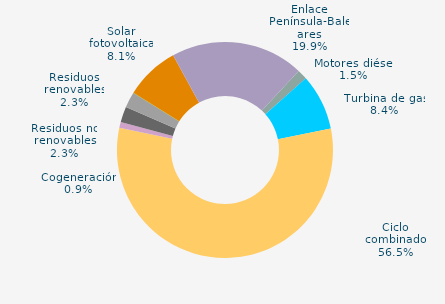
| Category | Series 0 |
|---|---|
| Carbón | 0 |
| Motores diésel | 1.506 |
| Turbina de gas | 8.363 |
| Ciclo combinado | 56.495 |
| Generación auxiliar | 0 |
| Cogeneración | 0.868 |
| Residuos no renovables | 2.334 |
| Residuos renovables | 2.334 |
| Eólica | 0.049 |
| Solar fotovoltaica | 8.119 |
| Otras renovables | 0.027 |
| Enlace Península-Baleares | 19.905 |